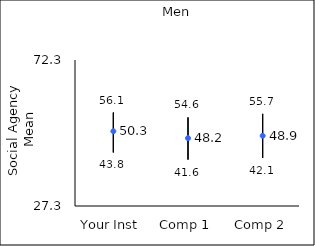
| Category | 25th percentile | 75th percentile | Mean |
|---|---|---|---|
| Your Inst | 43.8 | 56.1 | 50.34 |
| Comp 1 | 41.6 | 54.6 | 48.22 |
| Comp 2 | 42.1 | 55.7 | 48.94 |